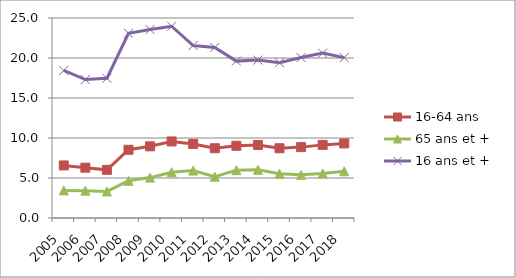
| Category | 16-64 ans | 65 ans et + | 16 ans et + |
|---|---|---|---|
| 2005.0 | 6.57 | 3.45 | 18.44 |
| 2006.0 | 6.29 | 3.41 | 17.3 |
| 2007.0 | 6.02 | 3.32 | 17.47 |
| 2008.0 | 8.53 | 4.65 | 23.09 |
| 2009.0 | 8.96 | 5.05 | 23.56 |
| 2010.0 | 9.57 | 5.72 | 23.97 |
| 2011.0 | 9.26 | 5.93 | 21.56 |
| 2012.0 | 8.72 | 5.16 | 21.32 |
| 2013.0 | 9.03 | 5.98 | 19.61 |
| 2014.0 | 9.13 | 6.02 | 19.74 |
| 2015.0 | 8.72 | 5.52 | 19.41 |
| 2016.0 | 8.86 | 5.4 | 20.06 |
| 2017.0 | 9.14 | 5.57 | 20.61 |
| 2018.0 | 9.32 | 5.84 | 20.05 |